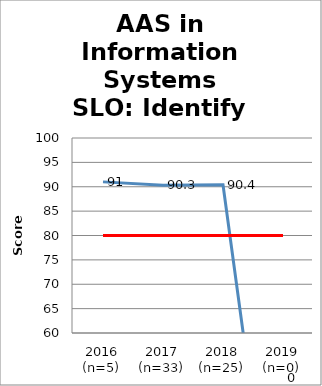
| Category | Series 0 | Series 1 |
|---|---|---|
| 2016 (n=5) | 91 | 80 |
| 2017 (n=33) | 90.3 | 80 |
| 2018 (n=25) | 90.4 | 80 |
| 2019 (n=0) | 0 | 80 |